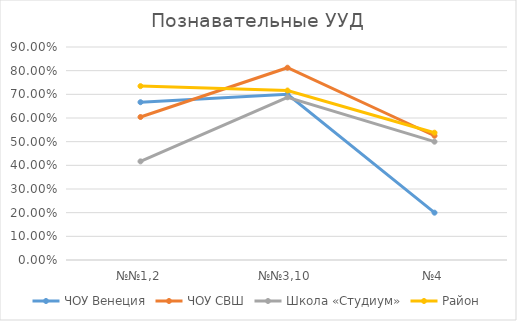
| Category | ЧОУ Венеция | ЧОУ СВШ | Школа «Студиум» | Район |
|---|---|---|---|---|
| №№1,2 | 0.667 | 0.604 | 0.417 | 0.735 |
| №№3,10 | 0.7 | 0.812 | 0.688 | 0.716 |
| №4 | 0.2 | 0.525 | 0.5 | 0.538 |